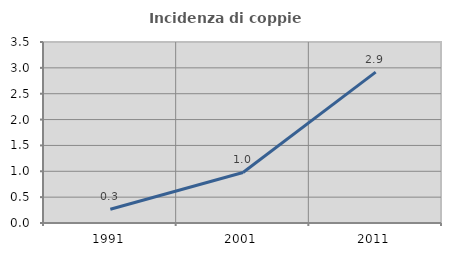
| Category | Incidenza di coppie miste |
|---|---|
| 1991.0 | 0.265 |
| 2001.0 | 0.978 |
| 2011.0 | 2.917 |